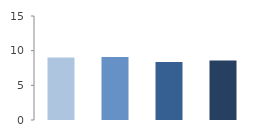
| Category | Rate (%) |
|---|---|
| 2009.0 | 9.003 |
| 2010.0 | 9.1 |
| 2011.0 | 8.359 |
| 2012.0 | 8.582 |